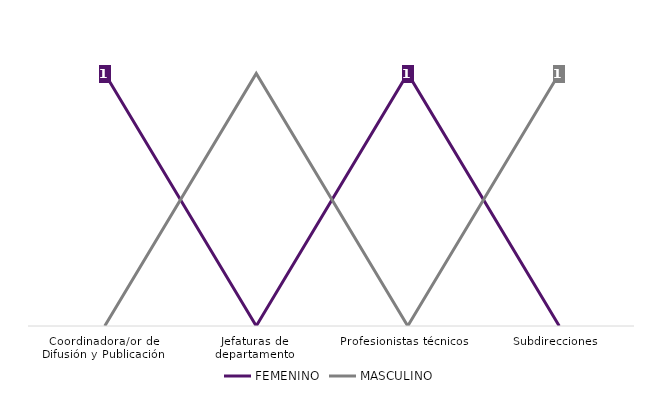
| Category | FEMENINO | MASCULINO |
|---|---|---|
| Coordinadora/or de Difusión y Publicación | 1 | 0 |
| Jefaturas de departamento | 0 | 1 |
| Profesionistas técnicos | 1 | 0 |
| Subdirecciones | 0 | 1 |